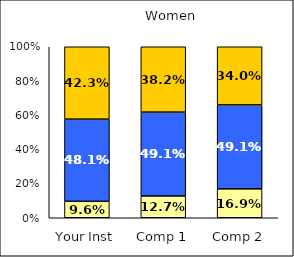
| Category | Low Career Related Stress | Average Career Related Stress | High Career Related Stress |
|---|---|---|---|
| Your Inst | 0.096 | 0.481 | 0.423 |
| Comp 1 | 0.127 | 0.491 | 0.382 |
| Comp 2 | 0.169 | 0.491 | 0.34 |